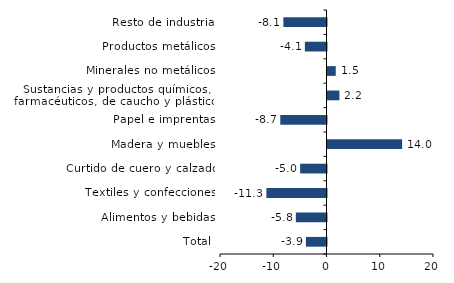
| Category | Series 0 |
|---|---|
| Total | -3.865 |
| Alimentos y bebidas | -5.76 |
| Textiles y confecciones | -11.29 |
| Curtido de cuero y calzado | -4.953 |
| Madera y muebles | 14.013 |
| Papel e imprentas | -8.68 |
| Sustancias y productos químicos, farmacéuticos, de caucho y plásticos | 2.238 |
| Minerales no metálicos | 1.548 |
| Productos metálicos | -4.063 |
| Resto de industria | -8.102 |